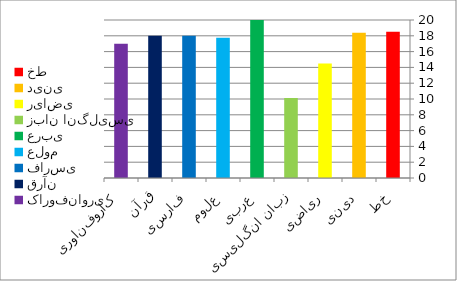
| Category | Series 0 |
|---|---|
| خط | 18.5 |
| دینی | 18.375 |
| ریاضی | 14.5 |
| زبان انگلیسی | 10.125 |
| عربی | 20 |
| علوم | 17.75 |
| فارسی | 18 |
| قرآن | 18 |
| کاروفناوری | 17 |